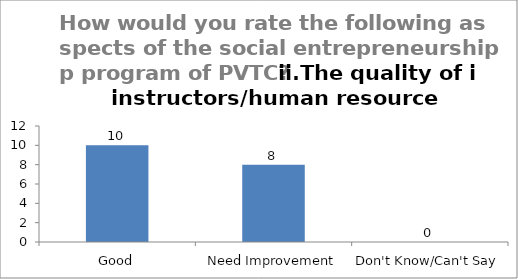
| Category | How would you rate the following aspects of the social entrepreneurship program of PVTC? Ii.The quality of instructors/human resource |
|---|---|
| Good | 10 |
| Need Improvement | 8 |
| Don't Know/Can't Say | 0 |